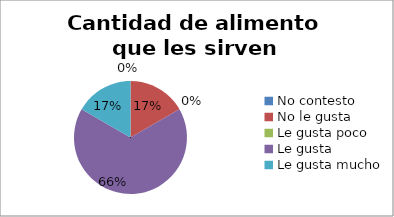
| Category | Series 0 |
|---|---|
| No contesto | 0 |
| No le gusta | 1 |
| Le gusta poco | 0 |
| Le gusta | 4 |
| Le gusta mucho | 1 |